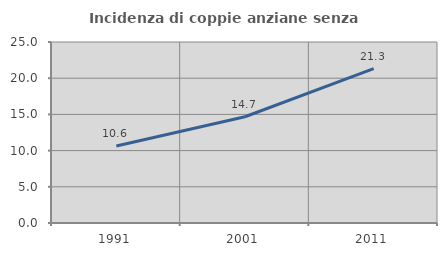
| Category | Incidenza di coppie anziane senza figli  |
|---|---|
| 1991.0 | 10.625 |
| 2001.0 | 14.675 |
| 2011.0 | 21.31 |